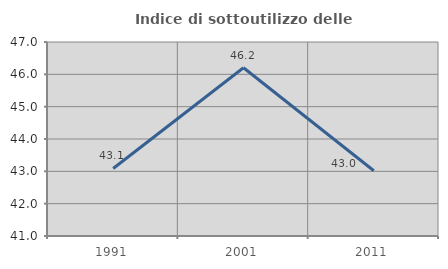
| Category | Indice di sottoutilizzo delle abitazioni  |
|---|---|
| 1991.0 | 43.089 |
| 2001.0 | 46.203 |
| 2011.0 | 43.019 |